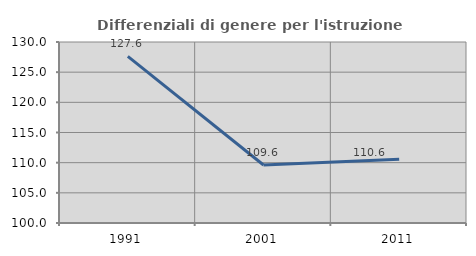
| Category | Differenziali di genere per l'istruzione superiore |
|---|---|
| 1991.0 | 127.607 |
| 2001.0 | 109.617 |
| 2011.0 | 110.558 |